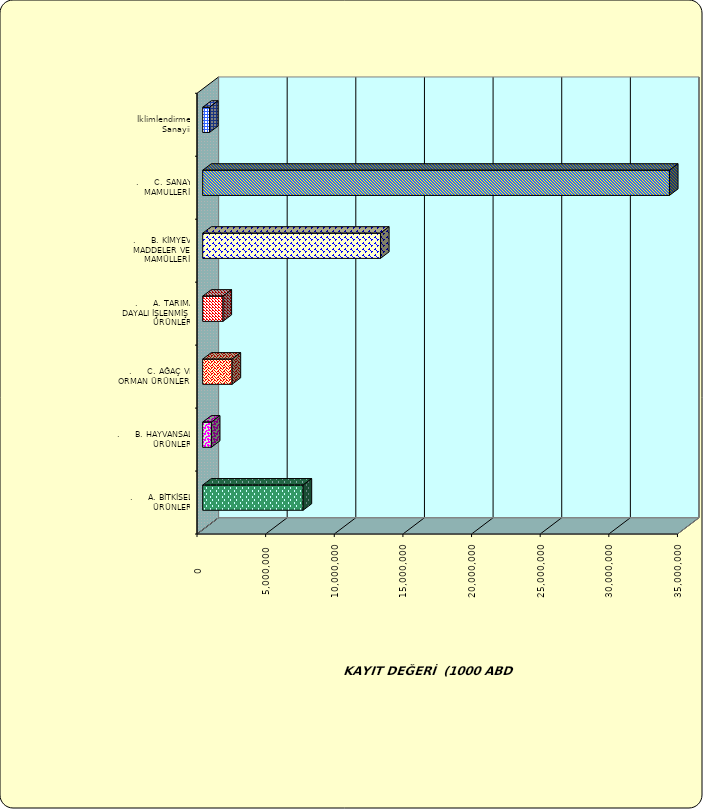
| Category | Series 0 |
|---|---|
| .     A. BİTKİSEL ÜRÜNLER | 7312610.537 |
| .     B. HAYVANSAL ÜRÜNLER | 632482.756 |
| .     C. AĞAÇ VE ORMAN ÜRÜNLERİ | 2139662.825 |
| .     A. TARIMA DAYALI İŞLENMİŞ ÜRÜNLER | 1478168.097 |
| .     B. KİMYEVİ MADDELER VE MAMÜLLERİ | 12952024.606 |
| .     C. SANAYİ MAMULLERİ | 34001321.89 |
|  İklimlendirme Sanayii | 497763.441 |